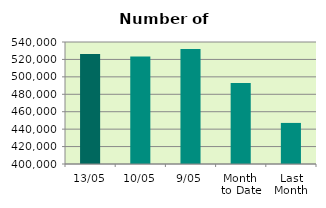
| Category | Series 0 |
|---|---|
| 13/05 | 526166 |
| 10/05 | 523286 |
| 9/05 | 532072 |
| Month 
to Date | 492875.25 |
| Last
Month | 447135.9 |